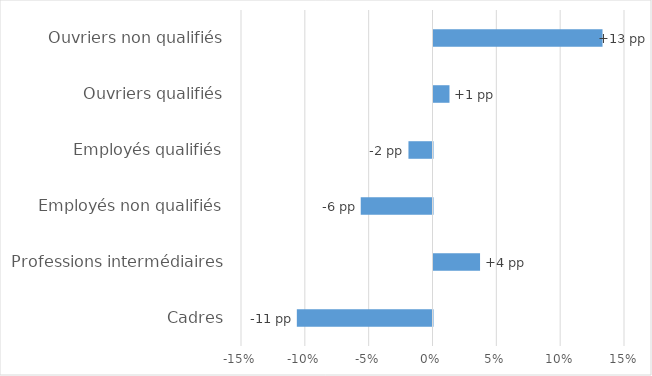
| Category | Series 0 |
|---|---|
| Cadres | -0.106 |
| Professions intermédiaires | 0.036 |
| Employés non qualifiés | -0.056 |
| Employés qualifiés | -0.019 |
| Ouvriers qualifiés | 0.013 |
| Ouvriers non qualifiés | 0.132 |